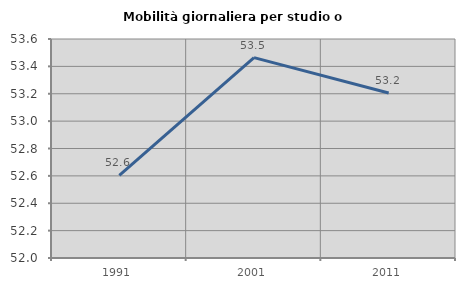
| Category | Mobilità giornaliera per studio o lavoro |
|---|---|
| 1991.0 | 52.604 |
| 2001.0 | 53.464 |
| 2011.0 | 53.206 |